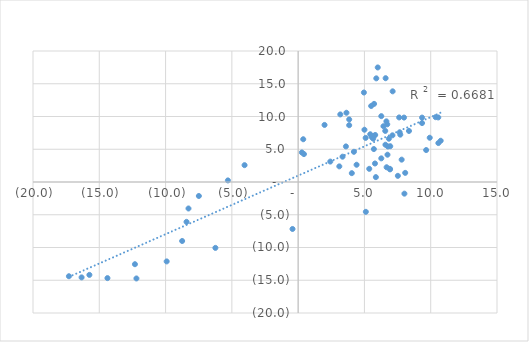
| Category | Series 0 |
|---|---|
| 7.521873133634425 | 0.94 |
| 8.074677059631373 | 1.393 |
| 6.916755874377008 | 2.012 |
| 4.4080697162766995 | 2.633 |
| 2.425791592289923 | 3.12 |
| 0.2800759822772877 | 4.512 |
| 0.383281829481419 | 6.527 |
| 1.9913169352499616 | 8.712 |
| 3.6440241945794773 | 10.57 |
| 5.728863083525811 | 11.927 |
| 7.128625243152454 | 13.843 |
| 6.598661913377235 | 15.847 |
| 6.004429700101305 | 17.488 |
| 5.8946408490050075 | 15.824 |
| 4.960380752760074 | 13.663 |
| 5.509116505171303 | 11.604 |
| 6.271782265877799 | 10.054 |
| 6.721948884286349 | 8.806 |
| 7.1136601299696345 | 7.126 |
| 6.947106719588749 | 5.462 |
| 6.739563131807191 | 4.167 |
| 6.272884348066449 | 3.609 |
| 5.795139565085137 | 2.826 |
| 5.363605016507068 | 2.012 |
| 4.048775788208226 | 1.349 |
| 3.1064106750065306 | 2.386 |
| 3.3492493448093685 | 3.865 |
| 3.6038038965431567 | 5.433 |
| 5.092734263720669 | 6.734 |
| 5.552745058901221 | 6.865 |
| 5.698628795924452 | 7.029 |
| 5.8127770724314916 | 7.178 |
| 5.4382187826567705 | 7.286 |
| 6.5705618389837275 | 7.799 |
| 6.435589666650364 | 8.516 |
| 6.6564412871497645 | 9.257 |
| 7.620644727198306 | 9.857 |
| 7.987451902990445 | 9.836 |
| 9.34700521191661 | 9.832 |
| 10.569815181933203 | 9.858 |
| 10.371024109346381 | 9.897 |
| 9.34686838508002 | 8.998 |
| 8.360507916246618 | 7.794 |
| 6.845339955391233 | 6.608 |
| 6.585447915577592 | 5.69 |
| 6.771173109597394 | 5.418 |
| 5.711683050293948 | 5.027 |
| 4.207075698505728 | 4.609 |
| 0.4373462250340965 | 4.261 |
| -4.04135761027652 | 2.572 |
| -5.299288045095029 | 0.242 |
| -7.489552748761162 | -2.136 |
| -8.270802767338573 | -4.044 |
| -8.418504290423892 | -6.085 |
| -8.749973556811199 | -9.007 |
| -9.916657300275482 | -12.124 |
| -12.19797950016633 | -14.727 |
| -14.384249593431104 | -14.674 |
| -16.334374185947496 | -14.564 |
| -17.291382654815543 | -14.387 |
| -15.746006827233803 | -14.18 |
| -12.310603889554269 | -12.551 |
| -6.241886843808052 | -10.059 |
| -0.4244208683711579 | -7.171 |
| 5.106086326511237 | -4.555 |
| 8.015805972582127 | -1.779 |
| 6.673767433321755 | 2.25 |
| 5.661673650105773 | 6.614 |
| 3.1801599304300225 | 10.316 |
| 3.8514295495123063 | 9.552 |
| 3.8498629223225223 | 8.67 |
| 5.001358544816742 | 7.98 |
| 7.656210445966817 | 7.584 |
| 7.704586551888736 | 7.228 |
| 9.926281052066761 | 6.756 |
| 10.75273701784293 | 6.297 |
| 10.576944485159087 | 5.945 |
| 9.656426160280448 | 4.877 |
| 7.808830248987029 | 3.413 |
| 6.933157694496918 | 1.929 |
| 5.863118256364407 | 0.745 |